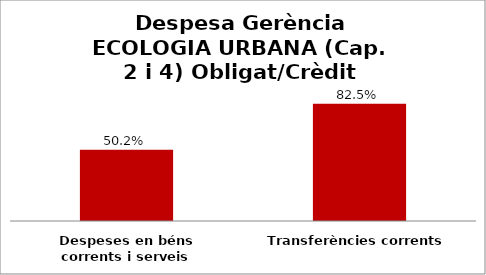
| Category | Series 0 |
|---|---|
| Despeses en béns corrents i serveis | 0.502 |
| Transferències corrents | 0.825 |